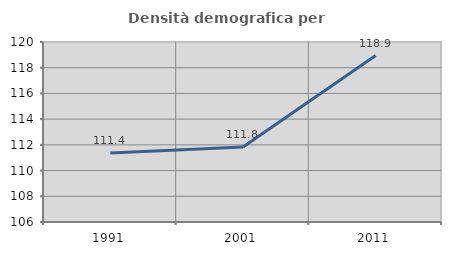
| Category | Densità demografica |
|---|---|
| 1991.0 | 111.375 |
| 2001.0 | 111.841 |
| 2011.0 | 118.941 |